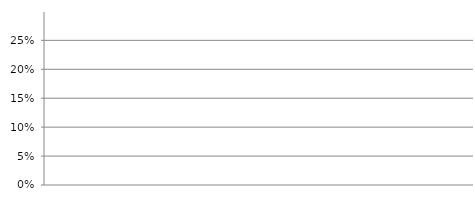
| Category | Investitionsanteil (Bruttoinvestitionen / Gesamtausgaben) |
|---|---|
| 2018.0 | 0 |
| 2019.0 | 0 |
| 2020.0 | 0 |
| 2021.0 | 0 |
| 2022.0 | 0 |